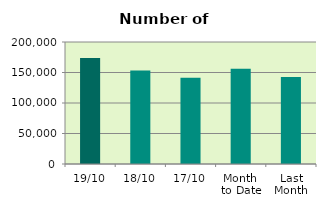
| Category | Series 0 |
|---|---|
| 19/10 | 173774 |
| 18/10 | 153346 |
| 17/10 | 141528 |
| Month 
to Date | 155965.467 |
| Last
Month | 142606.2 |